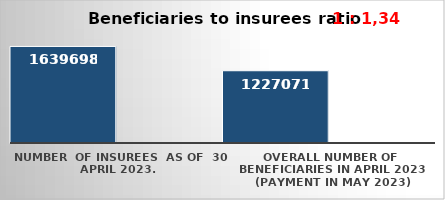
| Category | Series 0 | Series 1 |
|---|---|---|
| NUMBER  of insurees  as of  30 April 2023. | 1639698 |  |
| OVERALL number of beneficiaries in April 2023 (payment in May 2023) | 1227071 |  |